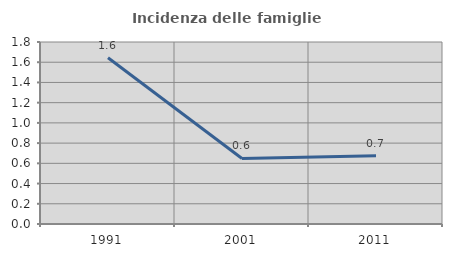
| Category | Incidenza delle famiglie numerose |
|---|---|
| 1991.0 | 1.644 |
| 2001.0 | 0.648 |
| 2011.0 | 0.676 |